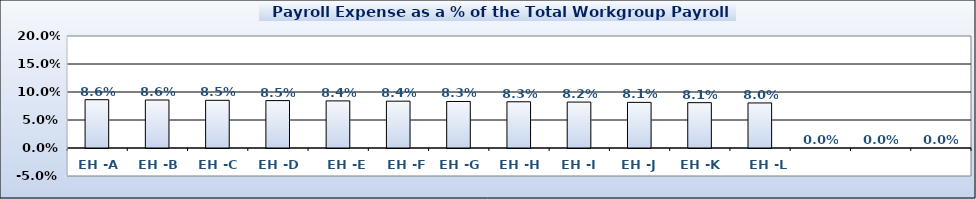
| Category | Series 0 |
|---|---|
| EH -A | 0.086 |
| EH -B | 0.086 |
| EH -C | 0.085 |
| EH -D | 0.085 |
| EH -E | 0.084 |
| EH -F | 0.084 |
| EH -G | 0.083 |
| EH -H | 0.083 |
| EH -I | 0.082 |
| EH -J | 0.081 |
| EH -K | 0.081 |
| EH -L | 0.08 |
|   | 0 |
|   | 0 |
|   | 0 |